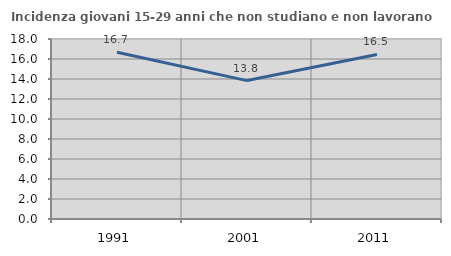
| Category | Incidenza giovani 15-29 anni che non studiano e non lavorano  |
|---|---|
| 1991.0 | 16.667 |
| 2001.0 | 13.841 |
| 2011.0 | 16.454 |